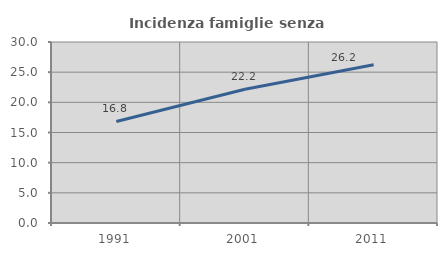
| Category | Incidenza famiglie senza nuclei |
|---|---|
| 1991.0 | 16.831 |
| 2001.0 | 22.167 |
| 2011.0 | 26.245 |